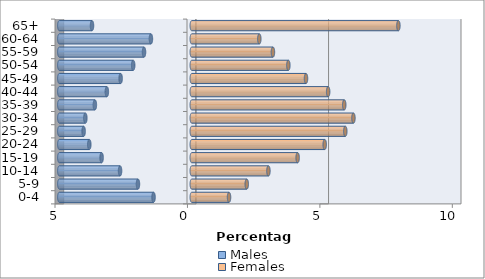
| Category | Males | Females |
|---|---|---|
| 0-4 | -1.444 | 1.406 |
| 5-9 | -2.032 | 2.076 |
| 10-14 | -2.708 | 2.893 |
| 15-19 | -3.405 | 3.996 |
| 20-24 | -3.869 | 5.019 |
| 25-29 | -4.083 | 5.796 |
| 30-34 | -4.018 | 6.103 |
| 35-39 | -3.659 | 5.756 |
| 40-44 | -3.206 | 5.149 |
| 45-49 | -2.686 | 4.312 |
| 50-54 | -2.212 | 3.646 |
| 55-59 | -1.803 | 3.064 |
| 60-64 | -1.543 | 2.55 |
| 65+ | -3.767 | 7.8 |